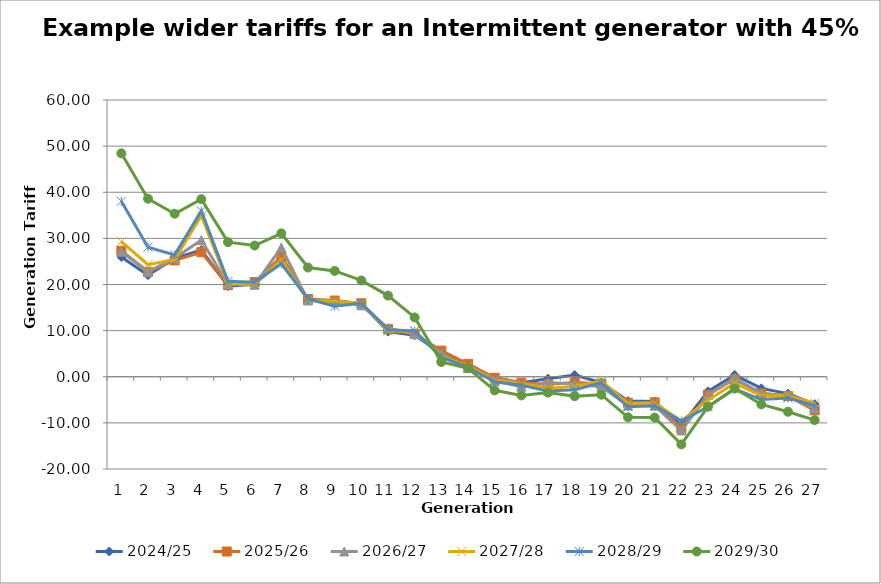
| Category | 2024/25 | 2025/26 | 2026/27 | 2027/28 | 2028/29 | 2029/30 |
|---|---|---|---|---|---|---|
| 0 | 25.966 | 27.316 | 27.102 | 29.288 | 38.064 | 48.431 |
| 1 | 22.02 | 22.753 | 22.738 | 24.294 | 28.099 | 38.604 |
| 2 | 25.685 | 25.22 | 25.724 | 25.432 | 26.417 | 35.346 |
| 3 | 27.478 | 26.997 | 29.642 | 34.92 | 35.951 | 38.491 |
| 4 | 19.658 | 19.848 | 20.05 | 20.195 | 20.685 | 29.188 |
| 5 | 20.067 | 20.514 | 19.946 | 20.075 | 20.514 | 28.444 |
| 6 | 25.261 | 26.059 | 28.038 | 25.397 | 24.489 | 31.086 |
| 7 | 16.688 | 16.872 | 16.53 | 16.595 | 16.871 | 23.68 |
| 8 | 16.336 | 16.517 | 16.424 | 16.316 | 15.302 | 22.946 |
| 9 | 15.867 | 15.921 | 15.478 | 15.99 | 15.94 | 20.879 |
| 10 | 9.788 | 10.344 | 10.56 | 9.853 | 10.191 | 17.593 |
| 11 | 8.988 | 9.255 | 9.281 | 9.876 | 9.931 | 12.862 |
| 12 | 5.059 | 5.667 | 5.028 | 4.442 | 4.229 | 3.189 |
| 13 | 2.59 | 2.798 | 1.907 | 2.293 | 2.011 | 1.826 |
| 14 | -0.27 | -0.216 | -0.863 | -0.673 | -1.077 | -2.948 |
| 15 | -1.318 | -1.276 | -2.151 | -1.427 | -1.848 | -4.051 |
| 16 | -0.42 | -1.621 | -1.227 | -2.498 | -3.111 | -3.443 |
| 17 | 0.364 | -1.239 | -1.591 | -2.088 | -2.836 | -4.213 |
| 18 | -1.253 | -1.529 | -2.166 | -0.896 | -1.306 | -3.897 |
| 19 | -5.268 | -5.642 | -6.235 | -5.824 | -6.505 | -8.786 |
| 20 | -5.366 | -5.54 | -6.261 | -5.712 | -6.289 | -8.847 |
| 21 | -10.566 | -11.197 | -11.632 | -9.591 | -9.598 | -14.668 |
| 22 | -3.154 | -3.876 | -3.963 | -5.063 | -6.516 | -6.485 |
| 23 | 0.395 | -0.502 | -0.294 | -1.398 | -2.645 | -2.552 |
| 24 | -2.521 | -3.608 | -3.648 | -4.14 | -4.951 | -6 |
| 25 | -3.653 | -4.179 | -4.034 | -4.08 | -4.606 | -7.585 |
| 26 | -5.93 | -7.284 | -6.828 | -5.714 | -6.258 | -9.399 |